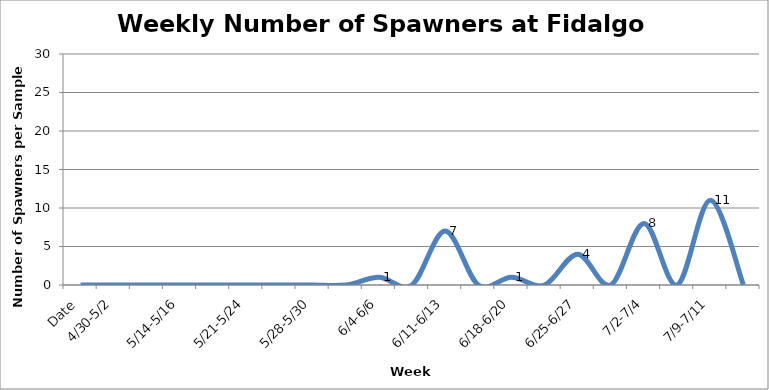
| Category | Series 0 |
|---|---|
| Date | 0 |
| 4/30-5/2 | 0 |
|  | 0 |
| 5/14-5/16 | 0 |
|  | 0 |
| 5/21-5/24 | 0 |
|  | 0 |
| 5/28-5/30 | 0 |
|  | 0 |
| 6/4-6/6 | 1 |
|  | 0 |
| 6/11-6/13 | 7 |
|  | 0 |
| 6/18-6/20 | 1 |
|  | 0 |
| 6/25-6/27 | 4 |
|  | 0 |
| 7/2-7/4 | 8 |
|  | 0 |
| 7/9-7/11 | 11 |